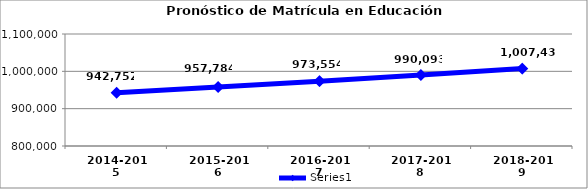
| Category | Series 0 |
|---|---|
| 2014-2015 | 942752.447 |
| 2015-2016 | 957784.328 |
| 2016-2017 | 973554.226 |
| 2017-2018 | 990093.139 |
| 2018-2019 | 1007433.553 |